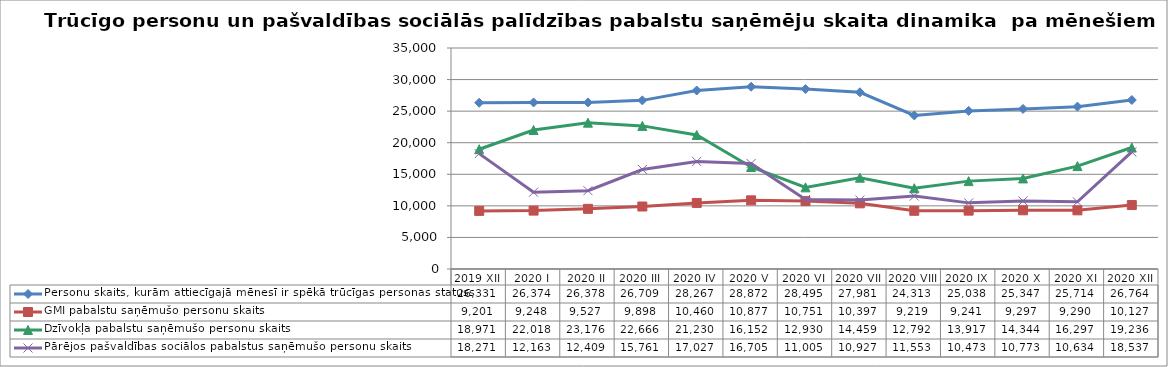
| Category | Personu skaits, kurām attiecīgajā mēnesī ir spēkā trūcīgas personas statuss | GMI pabalstu saņēmušo personu skaits | Dzīvokļa pabalstu saņēmušo personu skaits | Pārējos pašvaldības sociālos pabalstus saņēmušo personu skaits |
|---|---|---|---|---|
| 2019 XII | 26331 | 9201 | 18971 | 18271 |
| 2020 I | 26374 | 9248 | 22018 | 12163 |
| 2020 II | 26378 | 9527 | 23176 | 12409 |
| 2020 III | 26709 | 9898 | 22666 | 15761 |
| 2020 IV | 28267 | 10460 | 21230 | 17027 |
| 2020 V | 28872 | 10877 | 16152 | 16705 |
| 2020 VI | 28495 | 10751 | 12930 | 11005 |
| 2020 VII | 27981 | 10397 | 14459 | 10927 |
| 2020 VIII | 24313 | 9219 | 12792 | 11553 |
| 2020 IX | 25038 | 9241 | 13917 | 10473 |
| 2020 X | 25347 | 9297 | 14344 | 10773 |
| 2020 XI | 25714 | 9290 | 16297 | 10634 |
| 2020 XII | 26764 | 10127 | 19236 | 18537 |